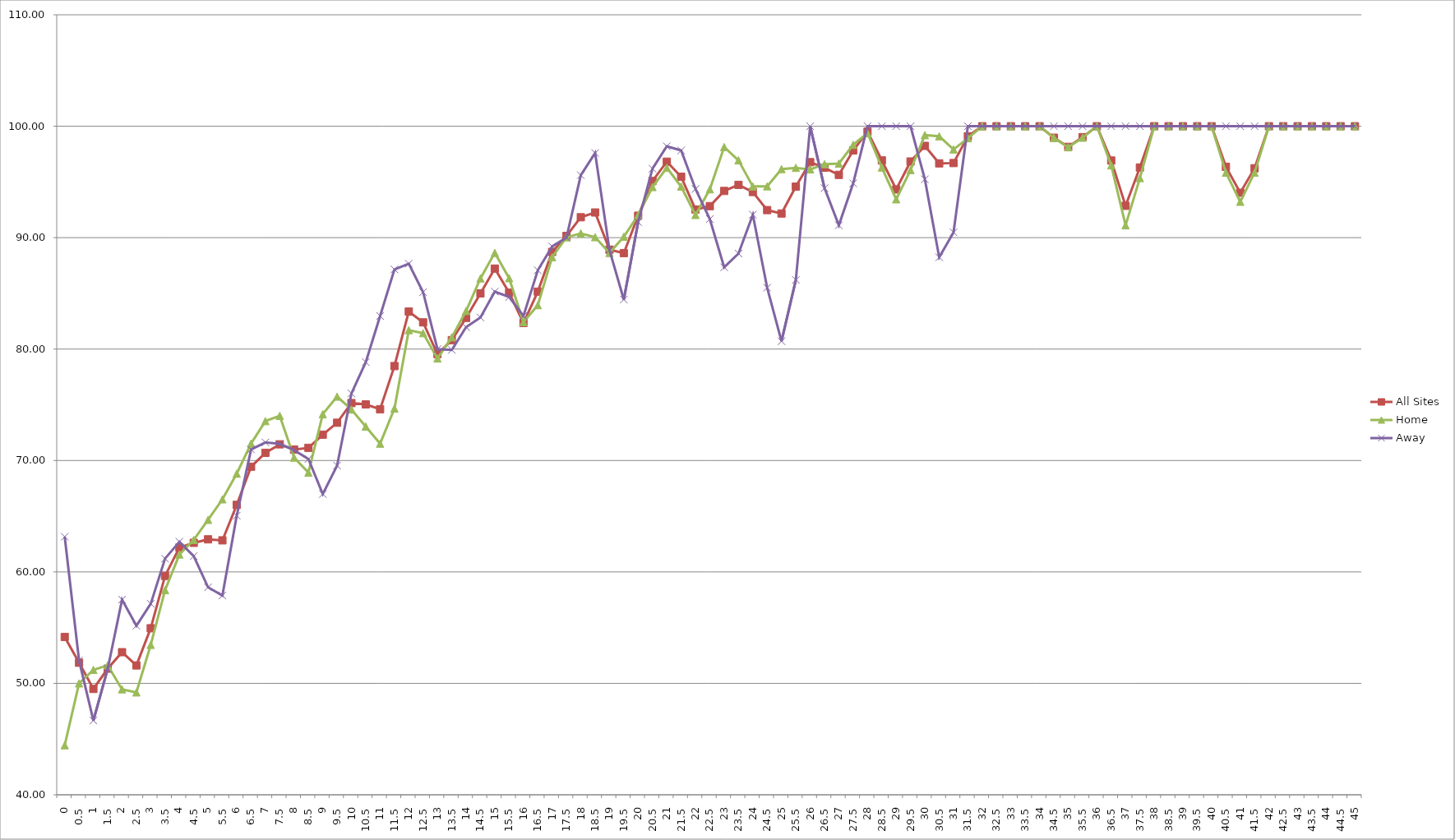
| Category | All Sites | Home | Away |
|---|---|---|---|
| 0.0 | 54.167 | 44.444 | 63.158 |
| 0.5 | 51.852 | 50 | 52.066 |
| 1.0 | 49.501 | 51.211 | 46.667 |
| 1.5 | 51.32 | 51.622 | 51.309 |
| 2.0 | 52.797 | 49.465 | 57.512 |
| 2.5 | 51.609 | 49.189 | 55.172 |
| 3.0 | 54.944 | 53.456 | 57.143 |
| 3.5 | 59.643 | 58.375 | 61.198 |
| 4.0 | 62.189 | 61.565 | 62.712 |
| 4.5 | 62.612 | 62.876 | 61.42 |
| 5.0 | 62.926 | 64.678 | 58.621 |
| 5.5 | 62.834 | 66.517 | 57.879 |
| 6.0 | 66.018 | 68.823 | 65.049 |
| 6.5 | 69.443 | 71.52 | 70.992 |
| 7.0 | 70.69 | 73.537 | 71.622 |
| 7.5 | 71.451 | 74.009 | 71.49 |
| 8.0 | 70.99 | 70.259 | 70.934 |
| 8.5 | 71.137 | 68.922 | 70.136 |
| 9.0 | 72.32 | 74.157 | 66.99 |
| 9.5 | 73.389 | 75.735 | 69.547 |
| 10.0 | 75.154 | 74.576 | 76.015 |
| 10.5 | 75.036 | 73.05 | 78.829 |
| 11.0 | 74.6 | 71.51 | 82.967 |
| 11.5 | 78.474 | 74.671 | 87.151 |
| 12.0 | 83.367 | 81.699 | 87.662 |
| 12.5 | 82.398 | 81.429 | 85.106 |
| 13.0 | 79.552 | 79.157 | 80 |
| 13.5 | 80.8 | 81.058 | 79.923 |
| 14.0 | 82.8 | 83.422 | 81.974 |
| 14.5 | 85 | 86.341 | 82.84 |
| 15.0 | 87.225 | 88.636 | 85.156 |
| 15.5 | 85.063 | 86.364 | 84.677 |
| 16.0 | 82.339 | 82.418 | 82.979 |
| 16.5 | 85.155 | 83.939 | 87.075 |
| 17.0 | 88.716 | 88.251 | 89.209 |
| 17.5 | 90.153 | 90.03 | 90 |
| 18.0 | 91.831 | 90.385 | 95.604 |
| 18.5 | 92.258 | 90.045 | 97.59 |
| 19.0 | 88.925 | 88.626 | 88.889 |
| 19.5 | 88.615 | 90.086 | 84.444 |
| 20.0 | 91.967 | 92.015 | 91.398 |
| 20.5 | 95.086 | 94.539 | 96.19 |
| 21.0 | 96.818 | 96.273 | 98.198 |
| 21.5 | 95.467 | 94.585 | 97.826 |
| 22.0 | 92.527 | 92.04 | 94.366 |
| 22.5 | 92.827 | 94.34 | 91.667 |
| 23.0 | 94.191 | 98.137 | 87.342 |
| 23.5 | 94.737 | 96.939 | 88.571 |
| 24.0 | 94.097 | 94.595 | 92.063 |
| 24.5 | 92.473 | 94.608 | 85.507 |
| 25.0 | 92.166 | 96.154 | 80.702 |
| 25.5 | 94.578 | 96.269 | 86.207 |
| 26.0 | 96.774 | 96.124 | 100 |
| 26.5 | 96.277 | 96.599 | 94.444 |
| 27.0 | 95.633 | 96.648 | 91.111 |
| 27.5 | 97.826 | 98.333 | 94.872 |
| 28.0 | 99.512 | 99.379 | 100 |
| 28.5 | 96.933 | 96.296 | 100 |
| 29.0 | 94.326 | 93.443 | 100 |
| 29.5 | 96.835 | 96.063 | 100 |
| 30.0 | 98.235 | 99.2 | 95.238 |
| 30.5 | 96.667 | 99.099 | 88.235 |
| 31.0 | 96.694 | 97.917 | 90.476 |
| 31.5 | 99.099 | 98.925 | 100 |
| 32.0 | 100 | 100 | 100 |
| 32.5 | 100 | 100 | 100 |
| 33.0 | 100 | 100 | 100 |
| 33.5 | 100 | 100 | 100 |
| 34.0 | 100 | 100 | 100 |
| 34.5 | 98.969 | 98.958 | 100 |
| 35.0 | 98.148 | 98.113 | 100 |
| 35.5 | 99.02 | 98.969 | 100 |
| 36.0 | 100 | 100 | 100 |
| 36.5 | 96.923 | 96.491 | 100 |
| 37.0 | 92.857 | 91.111 | 100 |
| 37.5 | 96.296 | 95.349 | 100 |
| 38.0 | 100 | 100 | 100 |
| 38.5 | 100 | 100 | 100 |
| 39.0 | 100 | 100 | 100 |
| 39.5 | 100 | 100 | 100 |
| 40.0 | 100 | 100 | 100 |
| 40.5 | 96.364 | 95.833 | 100 |
| 41.0 | 94.03 | 93.22 | 100 |
| 41.5 | 96.226 | 95.833 | 100 |
| 42.0 | 100 | 100 | 100 |
| 42.5 | 100 | 100 | 100 |
| 43.0 | 100 | 100 | 100 |
| 43.5 | 100 | 100 | 100 |
| 44.0 | 100 | 100 | 100 |
| 44.5 | 100 | 100 | 100 |
| 45.0 | 100 | 100 | 100 |